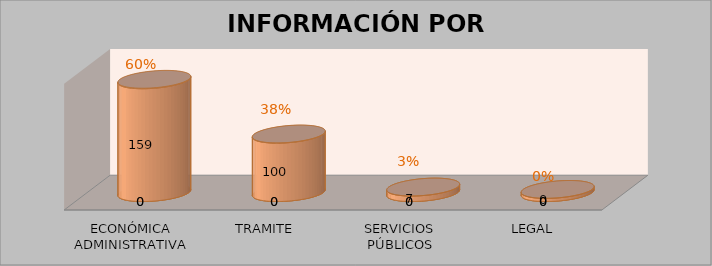
| Category | Series 0 | Series 1 | Series 2 | Series 3 |
|---|---|---|---|---|
| ECONÓMICA ADMINISTRATIVA |  |  | 143 | 0.627 |
| TRAMITE |  |  | 74 | 0.325 |
| SERVICIOS PÚBLICOS |  |  | 7 | 0.031 |
| LEGAL |  |  | 4 | 0.018 |